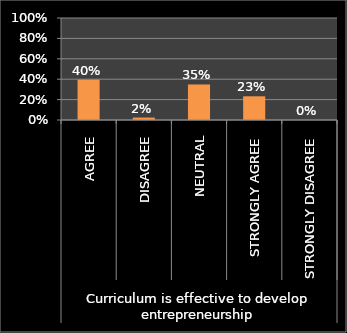
| Category | Series 0 |
|---|---|
| 0 | 0.395 |
| 1 | 0.024 |
| 2 | 0.348 |
| 3 | 0.232 |
| 4 | 0 |